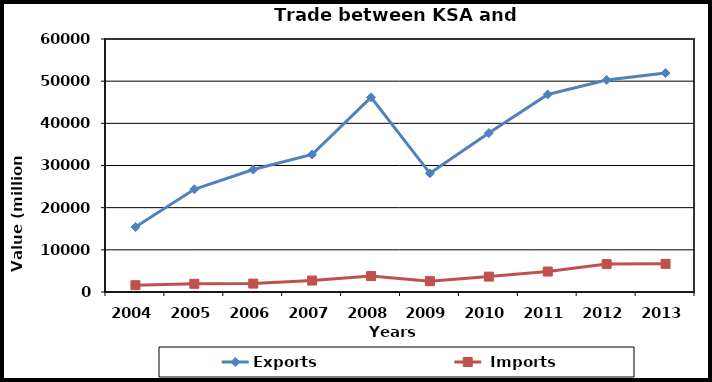
| Category | Exports |  Imports |
|---|---|---|
| 2004.0 | 15396 | 1615 |
| 2005.0 | 24366 | 1943 |
| 2006.0 | 29044 | 1992 |
| 2007.0 | 32605 | 2717 |
| 2008.0 | 46165 | 3778 |
| 2009.0 | 28151 | 2570 |
| 2010.0 | 37685 | 3649 |
| 2011.0 | 46848 | 4853 |
| 2012.0 | 50277 | 6622 |
| 2013.0 | 51921 | 6675 |